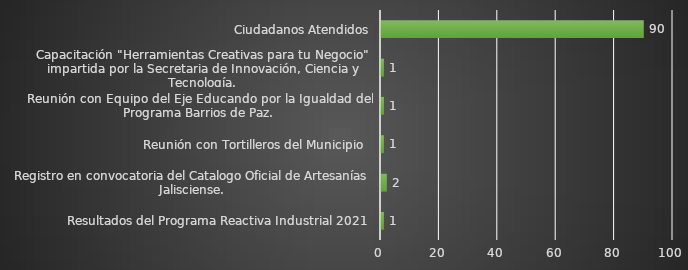
| Category | INDICADOR  |
|---|---|
| Resultados del Programa Reactiva Industrial 2021 | 1 |
| Registro en convocatoria del Catalogo Oficial de Artesanías Jalisciense. | 2 |
| Reunión con Tortilleros del Municipio  | 1 |
| Reunión con Equipo del Eje Educando por la Igualdad del Programa Barrios de Paz. | 1 |
| Capacitación "Herramientas Creativas para tu Negocio" impartida por la Secretaria de Innovación, Ciencia y Tecnología. | 1 |
| Ciudadanos Atendidos | 90 |